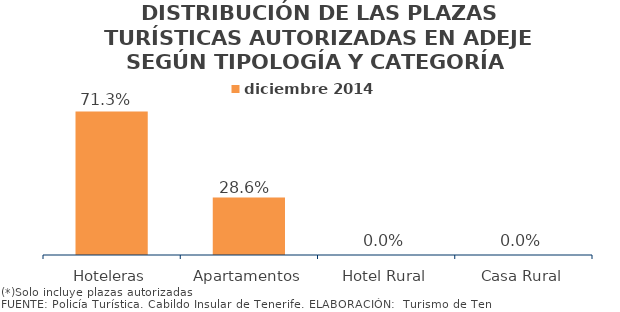
| Category | diciembre 2014 |
|---|---|
| Hoteleras | 0.713 |
| Apartamentos | 0.286 |
| Hotel Rural | 0 |
| Casa Rural | 0 |